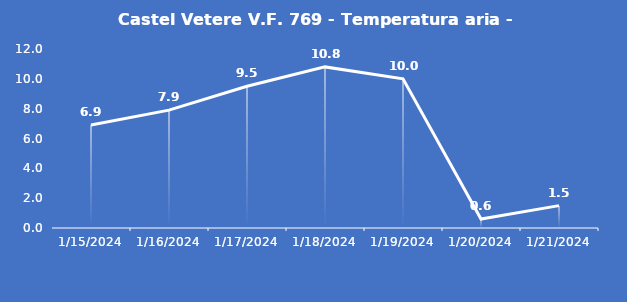
| Category | Castel Vetere V.F. 769 - Temperatura aria - Grezzo (°C) |
|---|---|
| 1/15/24 | 6.9 |
| 1/16/24 | 7.9 |
| 1/17/24 | 9.5 |
| 1/18/24 | 10.8 |
| 1/19/24 | 10 |
| 1/20/24 | 0.6 |
| 1/21/24 | 1.5 |